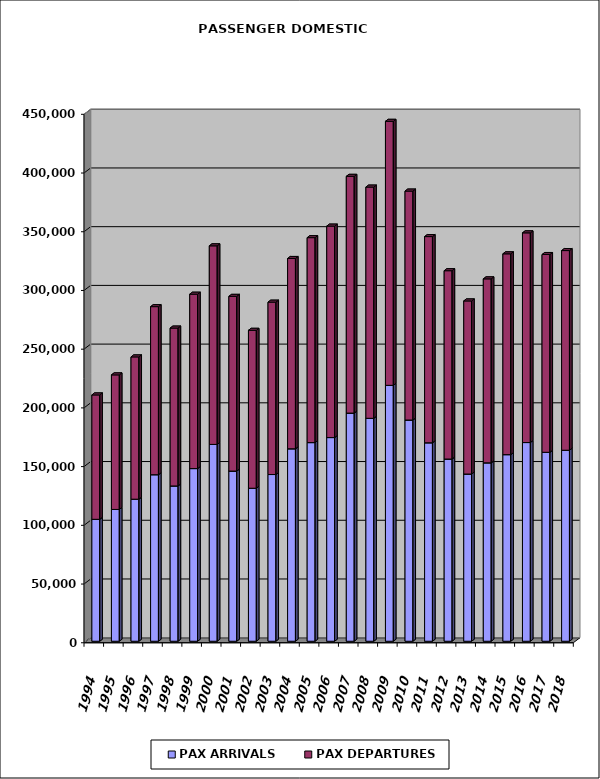
| Category | PAX ARRIVALS | PAX DEPARTURES |
|---|---|---|
| 1994.0 | 103837 | 105909 |
| 1995.0 | 112233 | 114583 |
| 1996.0 | 120971 | 121153 |
| 1997.0 | 141824 | 143102 |
| 1998.0 | 132259 | 134424 |
| 1999.0 | 147036 | 148488 |
| 2000.0 | 167611 | 169112 |
| 2001.0 | 144925 | 148763 |
| 2002.0 | 130292 | 134484 |
| 2003.0 | 141963 | 146797 |
| 2004.0 | 163896 | 162042 |
| 2005.0 | 169165 | 174511 |
| 2006.0 | 173442 | 180071 |
| 2007.0 | 194289 | 201597 |
| 2008.0 | 189840 | 196901 |
| 2009.0 | 217913 | 224830 |
| 2010.0 | 188384 | 194957 |
| 2011.0 | 169003 | 175577 |
| 2012.0 | 155168 | 160356 |
| 2013.0 | 142388 | 147404 |
| 2014.0 | 151913 | 156665 |
| 2015.0 | 158903 | 170995 |
| 2016.0 | 169204 | 178555 |
| 2017.0 | 160903 | 168422 |
| 2018.0 | 162657 | 170016 |